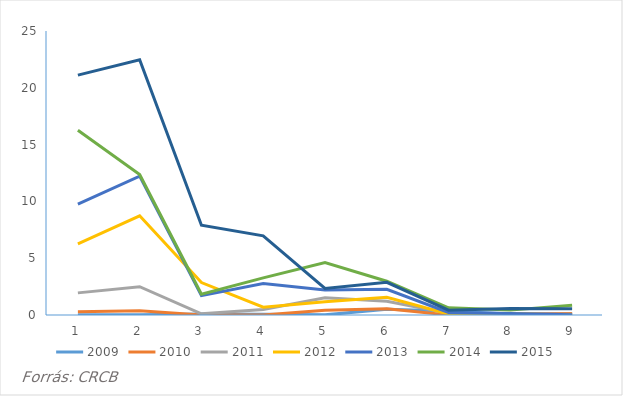
| Category | 2009 | 2010 | 2011 | 2012 | 2013 | 2014 | 2015 |
|---|---|---|---|---|---|---|---|
| 0 | 0.012 | 0.296 | 1.948 | 6.26 | 9.752 | 16.265 | 21.118 |
| 1 | 0.02 | 0.375 | 2.491 | 8.73 | 12.228 | 12.361 | 22.473 |
| 2 | 0.096 | 0.006 | 0.102 | 2.858 | 1.705 | 1.835 | 7.906 |
| 3 | 0.061 | 0 | 0.493 | 0.69 | 2.774 | 3.264 | 6.97 |
| 4 | 0.012 | 0.414 | 1.519 | 1.166 | 2.202 | 4.607 | 2.343 |
| 5 | 0.496 | 0.555 | 1.211 | 1.558 | 2.261 | 2.971 | 2.882 |
| 6 | 0.359 | 0.003 | 0.15 | 0.084 | 0.22 | 0.628 | 0.427 |
| 7 | 0.084 | 0.076 | 0.068 | 0.118 | 0.123 | 0.429 | 0.562 |
| 8 | 0.107 | 0.132 | 0.064 | 0.001 | 0.025 | 0.865 | 0.559 |